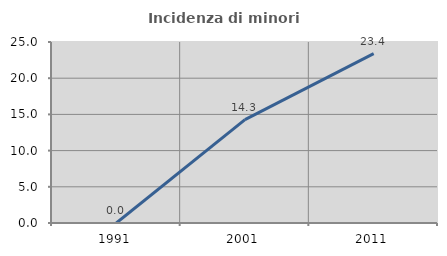
| Category | Incidenza di minori stranieri |
|---|---|
| 1991.0 | 0 |
| 2001.0 | 14.286 |
| 2011.0 | 23.387 |